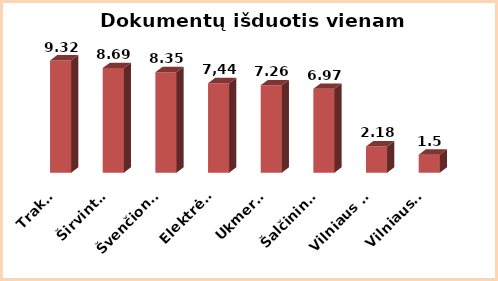
| Category | Series 0 |
|---|---|
|  Trakai | 9.32 |
|  Širvintos | 8.69 |
|  Švenčionys | 8.35 |
|  Elektrėnai | 7.43 |
|  Ukmergė | 7.26 |
|  Šalčininkai | 6.97 |
| Vilniaus m. | 2.18 |
|  Vilniaus r. | 1.5 |